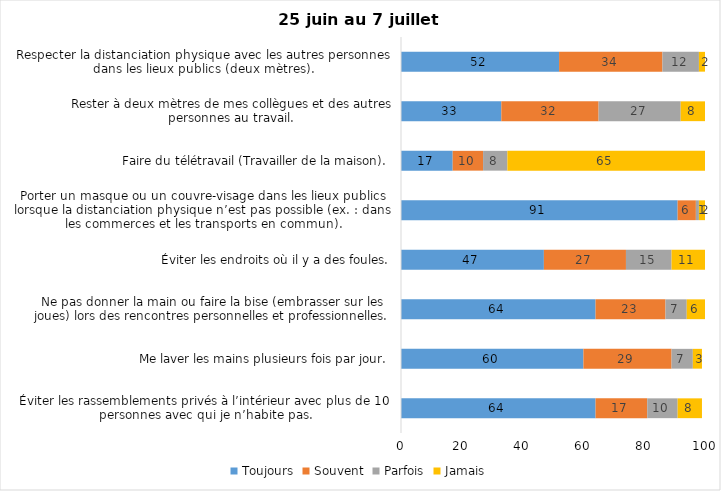
| Category | Toujours | Souvent | Parfois | Jamais |
|---|---|---|---|---|
| Éviter les rassemblements privés à l’intérieur avec plus de 10 personnes avec qui je n’habite pas. | 64 | 17 | 10 | 8 |
| Me laver les mains plusieurs fois par jour. | 60 | 29 | 7 | 3 |
| Ne pas donner la main ou faire la bise (embrasser sur les joues) lors des rencontres personnelles et professionnelles. | 64 | 23 | 7 | 6 |
| Éviter les endroits où il y a des foules. | 47 | 27 | 15 | 11 |
| Porter un masque ou un couvre-visage dans les lieux publics lorsque la distanciation physique n’est pas possible (ex. : dans les commerces et les transports en commun). | 91 | 6 | 1 | 2 |
| Faire du télétravail (Travailler de la maison). | 17 | 10 | 8 | 65 |
| Rester à deux mètres de mes collègues et des autres personnes au travail. | 33 | 32 | 27 | 8 |
| Respecter la distanciation physique avec les autres personnes dans les lieux publics (deux mètres). | 52 | 34 | 12 | 2 |